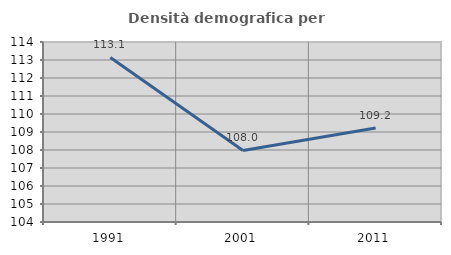
| Category | Densità demografica |
|---|---|
| 1991.0 | 113.14 |
| 2001.0 | 107.972 |
| 2011.0 | 109.225 |